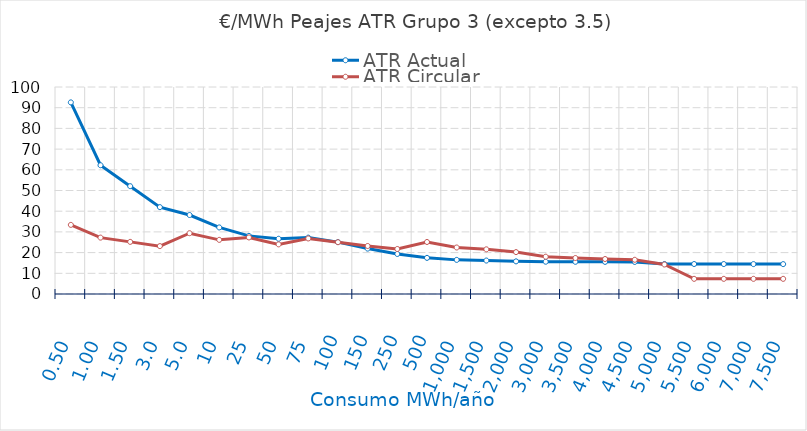
| Category | ATR Actual | ATR Circular |
|---|---|---|
| 0.5 | 92.565 | 33.394 |
| 1.0 | 62.205 | 27.238 |
| 1.5 | 52.085 | 25.186 |
| 3.0 | 41.965 | 23.134 |
| 5.0 | 38.156 | 29.368 |
| 10.0 | 32.158 | 26.158 |
| 25.0 | 28.075 | 27.324 |
| 50.0 | 26.686 | 23.979 |
| 75.0 | 27.235 | 26.833 |
| 100.0 | 25.066 | 25.018 |
| 150.0 | 21.932 | 23.202 |
| 250.0 | 19.341 | 21.75 |
| 500.0 | 17.458 | 25.13 |
| 1000.0 | 16.486 | 22.467 |
| 1500.0 | 16.162 | 21.579 |
| 2000.0 | 15.762 | 20.237 |
| 3000.0 | 15.601 | 18.016 |
| 3500.0 | 15.554 | 17.381 |
| 4000.0 | 15.52 | 16.905 |
| 4500.0 | 15.493 | 16.534 |
| 5000.0 | 14.5 | 14.245 |
| 5500.0 | 14.483 | 7.322 |
| 6000.0 | 14.468 | 7.322 |
| 7000.0 | 14.445 | 7.322 |
| 7500.0 | 14.436 | 7.322 |